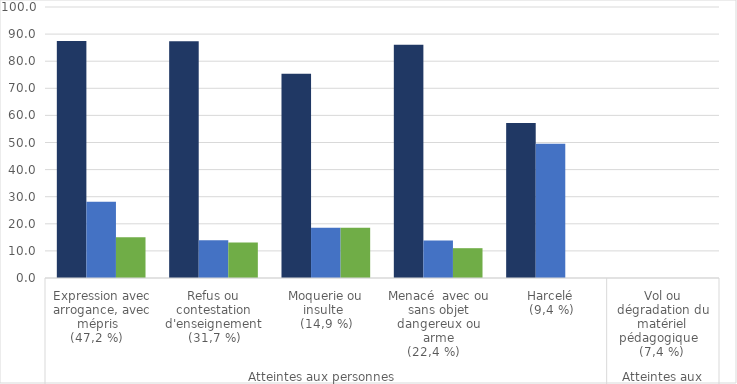
| Category | Parents d'élèves  | Collègues ou hiérarchie | Elèves ou groupe d'élèves |
|---|---|---|---|
| 0 | 87.5 | 28.1 | 15 |
| 1 | 87.4 | 13.9 | 13.1 |
| 2 | 75.4 | 18.5 | 18.5 |
| 3 | 86.1 | 13.8 | 11 |
| 4 | 57.2 | 49.5 | 0 |
| 5 | 0 | 0 | 0 |